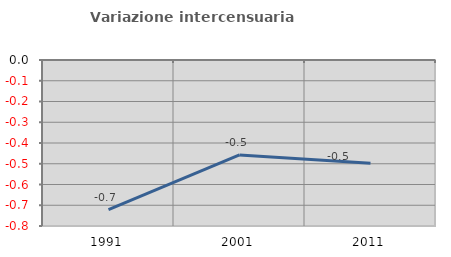
| Category | Variazione intercensuaria annua |
|---|---|
| 1991.0 | -0.721 |
| 2001.0 | -0.457 |
| 2011.0 | -0.498 |